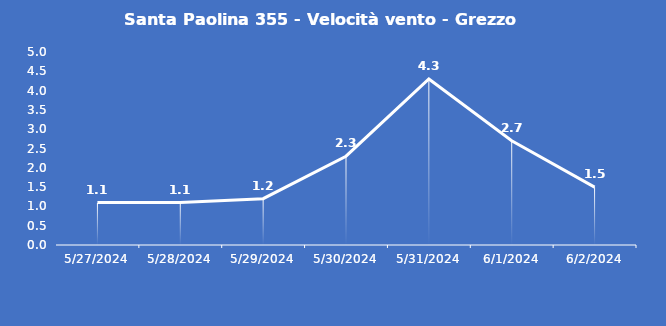
| Category | Santa Paolina 355 - Velocità vento - Grezzo (m/s) |
|---|---|
| 5/27/24 | 1.1 |
| 5/28/24 | 1.1 |
| 5/29/24 | 1.2 |
| 5/30/24 | 2.3 |
| 5/31/24 | 4.3 |
| 6/1/24 | 2.7 |
| 6/2/24 | 1.5 |